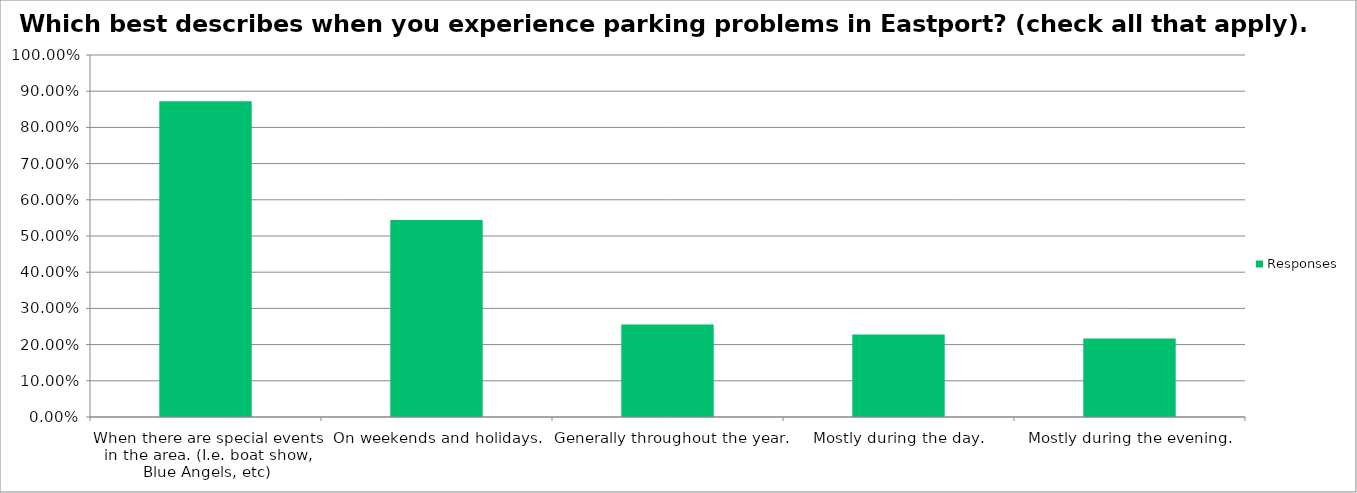
| Category | Responses |
|---|---|
| When there are special events in the area. (I.e. boat show, Blue Angels, etc) | 0.872 |
| On weekends and holidays. | 0.544 |
| Generally throughout the year. | 0.256 |
| Mostly during the day. | 0.228 |
| Mostly during the evening. | 0.217 |